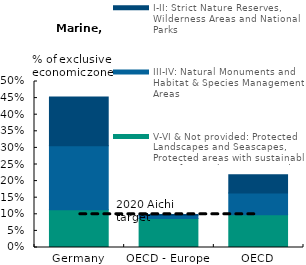
| Category | V-VI & Not provided: Protected Landscapes and Seascapes, Protected areas with sustainable use of natural resources and areas with no management category provided | III-IV: Natural Monuments and Habitat & Species Management Areas | I-II: Strict Nature Reserves, Wilderness Areas and National Parks |
|---|---|---|---|
| Germany | 0.114 | 0.193 | 0.146 |
| OECD - Europe | 0.087 | 0.01 | 0.003 |
| OECD | 0.098 | 0.066 | 0.055 |